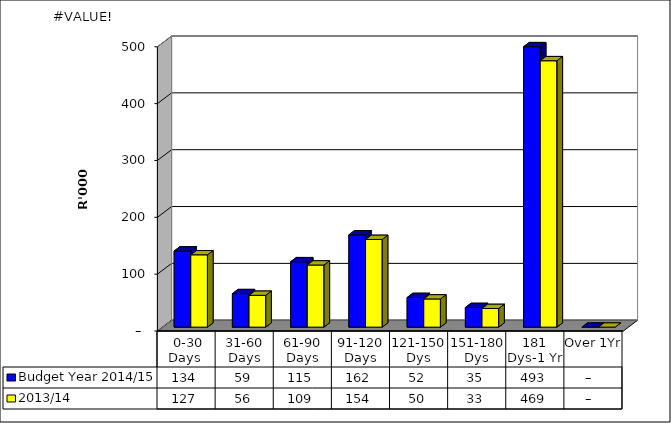
| Category | Budget Year 2014/15 | 2013/14 |
|---|---|---|
|  0-30 Days  | 133962 | 127263.9 |
| 31-60 Days | 58930 | 55983.5 |
| 61-90 Days | 115047 | 109294.65 |
| 91-120 Days | 162400 | 154280 |
| 121-150 Dys | 52166 | 49557.7 |
| 151-180 Dys | 34535 | 32808.25 |
| 181 Dys-1 Yr | 493321 | 468654.95 |
| Over 1Yr | 0 | 0 |